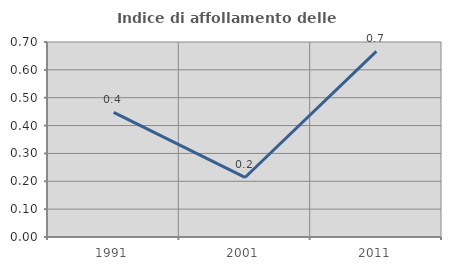
| Category | Indice di affollamento delle abitazioni  |
|---|---|
| 1991.0 | 0.447 |
| 2001.0 | 0.214 |
| 2011.0 | 0.667 |